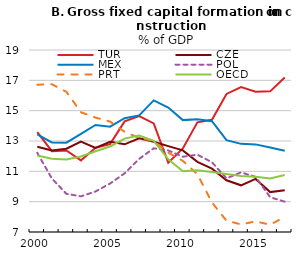
| Category | TUR | CZE | MEX | POL | PRT | OECD |
|---|---|---|---|---|---|---|
| 2000.0 | 13.59 | 12.62 | 13.437 | 12.222 | 16.709 | 12.042 |
| 2001.0 | 12.331 | 12.38 | 12.909 | 10.532 | 16.745 | 11.829 |
| 2002.0 | 12.375 | 12.495 | 12.892 | 9.516 | 16.24 | 11.776 |
| 2003.0 | 11.723 | 12.968 | 13.472 | 9.352 | 14.896 | 11.98 |
| 2004.0 | 12.55 | 12.544 | 14.054 | 9.671 | 14.545 | 12.32 |
| 2005.0 | 12.793 | 12.942 | 13.947 | 10.195 | 14.282 | 12.639 |
| 2006.0 | 14.296 | 12.782 | 14.503 | 10.869 | 13.605 | 13.158 |
| 2007.0 | 14.648 | 13.183 | 14.69 | 11.822 | 13.202 | 13.355 |
| 2008.0 | 14.162 | 12.955 | 15.678 | 12.519 | 12.994 | 13.009 |
| 2009.0 | 11.566 | 12.662 | 15.208 | 12.376 | 12.232 | 11.792 |
| 2010.0 | 12.506 | 12.384 | 14.377 | 11.962 | 11.693 | 11.009 |
| 2011.0 | 14.234 | 11.63 | 14.438 | 12.097 | 10.808 | 11.066 |
| 2012.0 | 14.397 | 11.175 | 14.308 | 11.6 | 8.95 | 10.961 |
| 2013.0 | 16.103 | 10.413 | 13.053 | 10.54 | 7.742 | 10.829 |
| 2014.0 | 16.554 | 10.079 | 12.811 | 10.931 | 7.502 | 10.691 |
| 2015.0 | 16.255 | 10.502 | 12.777 | 10.632 | 7.699 | 10.65 |
| 2016.0 | 16.273 | 9.632 | 12.576 | 9.293 | 7.483 | 10.525 |
| 2017.0 | 17.192 | 9.754 | 12.362 | 9 | 7.99 | 10.756 |